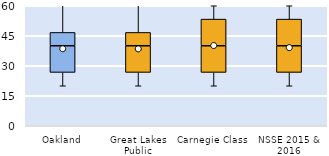
| Category | 25th | 50th | 75th |
|---|---|---|---|
| Oakland | 26.667 | 13.333 | 6.667 |
| Great Lakes Public | 26.667 | 13.333 | 6.667 |
| Carnegie Class | 26.667 | 13.333 | 13.333 |
| NSSE 2015 & 2016 | 26.667 | 13.333 | 13.333 |